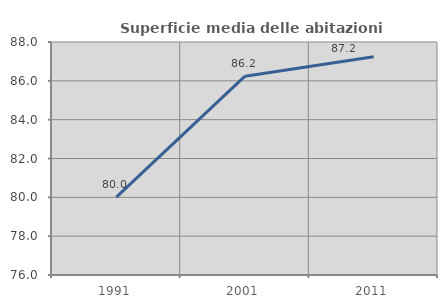
| Category | Superficie media delle abitazioni occupate |
|---|---|
| 1991.0 | 80.011 |
| 2001.0 | 86.241 |
| 2011.0 | 87.24 |